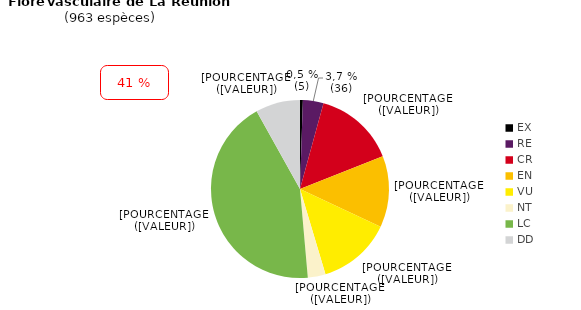
| Category | Series 0 |
|---|---|
| EX | 5 |
| RE | 36 |
| CR | 142 |
| EN | 125 |
| VU | 129 |
| NT | 31 |
| LC | 417 |
| DD | 78 |